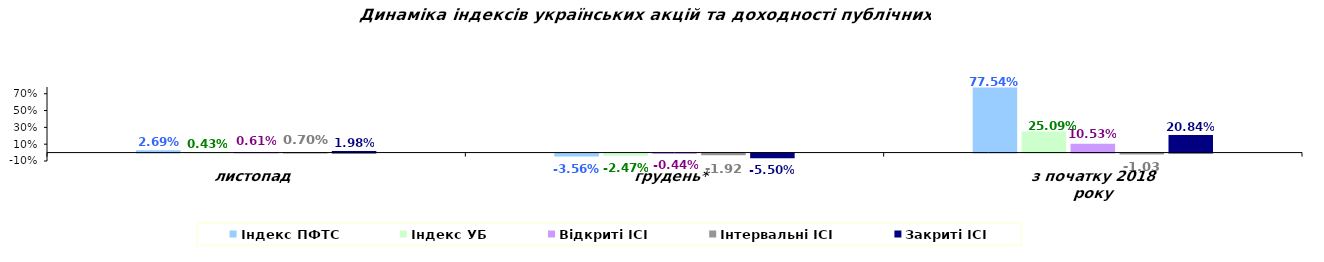
| Category | Індекс ПФТС | Індекс УБ | Відкриті ІСІ | Інтервальні ІСІ | Закриті ІСІ |
|---|---|---|---|---|---|
| листопад | 0.027 | 0.004 | 0.006 | 0.007 | 0.02 |
| грудень* | -0.036 | -0.025 | -0.004 | -0.019 | -0.055 |
| з початку 2018 року | 0.775 | 0.251 | 0.105 | -0.01 | 0.208 |